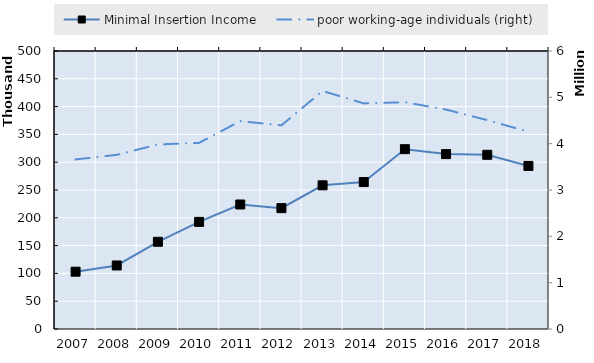
| Category | Minimal Insertion Income | Survivors' pension from occupational accident insurance | 0 | Series 14 | Series 15 | Series 16 | Series 17 | Series 18 | Series 19 |
|---|---|---|---|---|---|---|---|---|---|
| 2007.0 | 103071 |  |  |  |  |  |  |  |  |
| 2008.0 | 114257 |  |  |  |  |  |  |  |  |
| 2009.0 | 156858 |  |  |  |  |  |  |  |  |
| 2010.0 | 192633 |  |  |  |  |  |  |  |  |
| 2011.0 | 223940 |  |  |  |  |  |  |  |  |
| 2012.0 | 217358 |  |  |  |  |  |  |  |  |
| 2013.0 | 258408 |  |  |  |  |  |  |  |  |
| 2014.0 | 264279 |  |  |  |  |  |  |  |  |
| 2015.0 | 323406 |  |  |  |  |  |  |  |  |
| 2016.0 | 314562 |  |  |  |  |  |  |  |  |
| 2017.0 | 313291 |  |  |  |  |  |  |  |  |
| 2018.0 | 293302 |  |  |  |  |  |  |  |  |